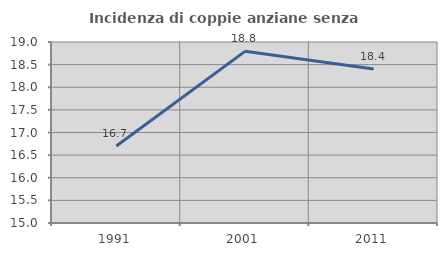
| Category | Incidenza di coppie anziane senza figli  |
|---|---|
| 1991.0 | 16.701 |
| 2001.0 | 18.794 |
| 2011.0 | 18.402 |